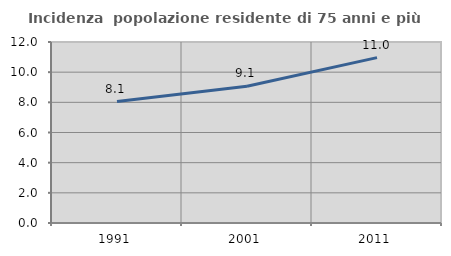
| Category | Incidenza  popolazione residente di 75 anni e più |
|---|---|
| 1991.0 | 8.052 |
| 2001.0 | 9.065 |
| 2011.0 | 10.966 |